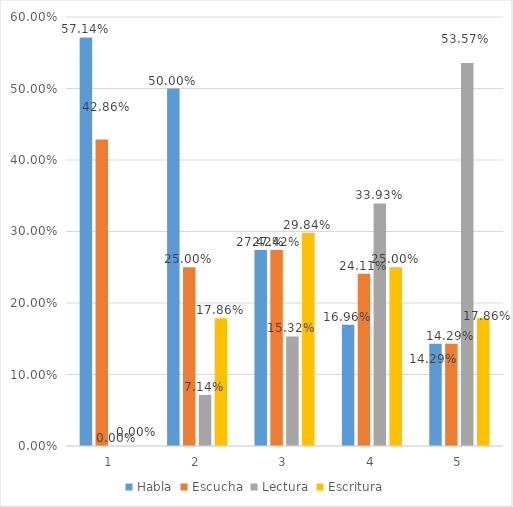
| Category | Habla | Escucha | Lectura | Escritura |
|---|---|---|---|---|
| 0 | 0.571 | 0.429 | 0 | 0 |
| 1 | 0.5 | 0.25 | 0.071 | 0.179 |
| 2 | 0.274 | 0.274 | 0.153 | 0.298 |
| 3 | 0.17 | 0.241 | 0.339 | 0.25 |
| 4 | 0.143 | 0.143 | 0.536 | 0.179 |